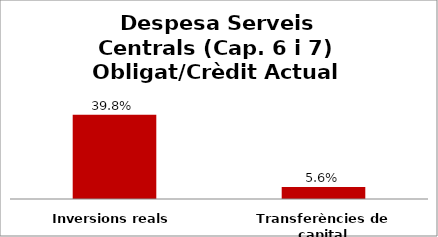
| Category | Series 0 |
|---|---|
| Inversions reals | 0.398 |
| Transferències de capital | 0.056 |